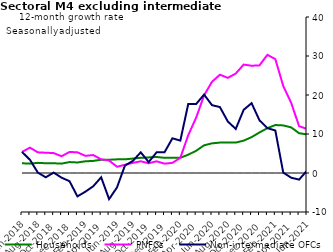
| Category | zero | Households | PNFCs | Non-intermediate OFCs |
|---|---|---|---|---|
| Jun-2018 | 0 | 2.5 | 5.4 | 5.4 |
| Jul-2018 | 0 | 2.4 | 6.5 | 3.4 |
| Aug-2018 | 0 | 2.6 | 5.3 | 0.1 |
| Sep-2018 | 0 | 2.5 | 5.2 | -1.1 |
| Oct-2018 | 0 | 2.5 | 5.1 | 0.1 |
| Nov-2018 | 0 | 2.4 | 4.3 | -1.2 |
| Dec-2018 | 0 | 2.8 | 5.4 | -2.1 |
| Jan-2019 | 0 | 2.7 | 5.3 | -6 |
| Feb-2019 | 0 | 3 | 4.4 | -4.8 |
| Mar-2019 | 0 | 3.1 | 4.6 | -3.4 |
| Apr-2019 | 0 | 3.4 | 3.5 | -1.1 |
| May-2019 | 0 | 3.4 | 3.2 | -6.7 |
| Jun-2019 | 0 | 3.5 | 1.6 | -3.7 |
| Jul-2019 | 0 | 3.5 | 2.1 | 1.9 |
| Aug-2019 | 0 | 3.7 | 2.6 | 3.1 |
| Sep-2019 | 0 | 3.9 | 3 | 5.3 |
| Oct-2019 | 0 | 4 | 2.5 | 2.8 |
| Nov-2019 | 0 | 4.1 | 3 | 5.3 |
| Dec-2019 | 0 | 3.9 | 2.4 | 5.3 |
| Jan-2020 | 0 | 3.9 | 2.6 | 8.9 |
| Feb-2020 | 0 | 3.9 | 3.9 | 8.3 |
| Mar-2020 | 0 | 4.7 | 9.7 | 17.7 |
| Apr-2020 | 0 | 5.7 | 14.2 | 17.7 |
| May-2020 | 0 | 7.1 | 19.9 | 20.1 |
| Jun-2020 | 0 | 7.6 | 23.4 | 17.4 |
| Jul-2020 | 0 | 7.8 | 25.2 | 16.9 |
| Aug-2020 | 0 | 7.8 | 24.4 | 13.2 |
| Sep-2020 | 0 | 7.8 | 25.5 | 11.3 |
| Oct-2020 | 0 | 8.3 | 27.8 | 16.2 |
| Nov-2020 | 0 | 9.2 | 27.5 | 17.9 |
| Dec-2020 | 0 | 10.4 | 27.6 | 13.5 |
| Jan-2021 | 0 | 11.5 | 30.3 | 11.5 |
| Feb-2021 | 0 | 12.3 | 29.2 | 10.9 |
| Mar-2021 | 0 | 12.2 | 22.3 | 0.1 |
| Apr-2021 | 0 | 11.7 | 18 | -1.2 |
| May-2021 | 0 | 10.2 | 12 | -1.7 |
| Jun-2021 | 0 | 9.9 | 11.3 | 0.6 |